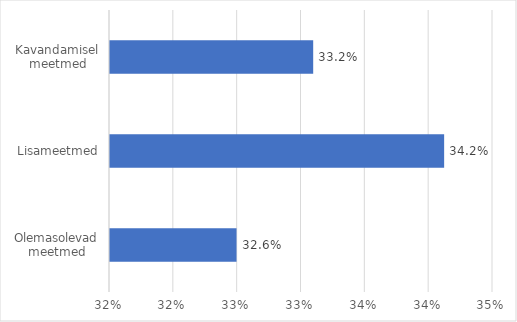
| Category | Series 0 |
|---|---|
| Olemasolevad meetmed | 0.326 |
| Lisameetmed | 0.342 |
| Kavandamisel meetmed | 0.332 |